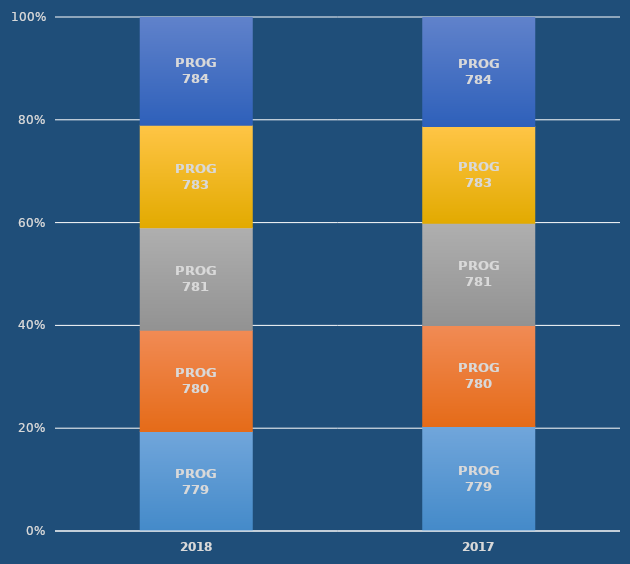
| Category | PROG 779 | PROG 780 | PROG 781 | PROG 783 | PROG 784 |
|---|---|---|---|---|---|
| 2018.0 | 0.895 | 0.907 | 0.916 | 0.918 | 0.965 |
| 2017.0 | 0.892 | 0.857 | 0.866 | 0.821 | 0.926 |